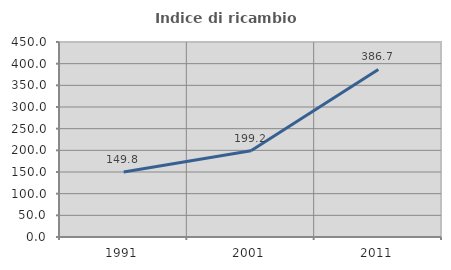
| Category | Indice di ricambio occupazionale  |
|---|---|
| 1991.0 | 149.818 |
| 2001.0 | 199.223 |
| 2011.0 | 386.662 |